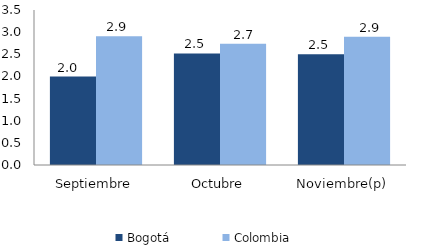
| Category | Bogotá | Colombia |
|---|---|---|
| Septiembre | 1.998 | 2.905 |
| Octubre | 2.52 | 2.739 |
| Noviembre(p) | 2.5 | 2.899 |